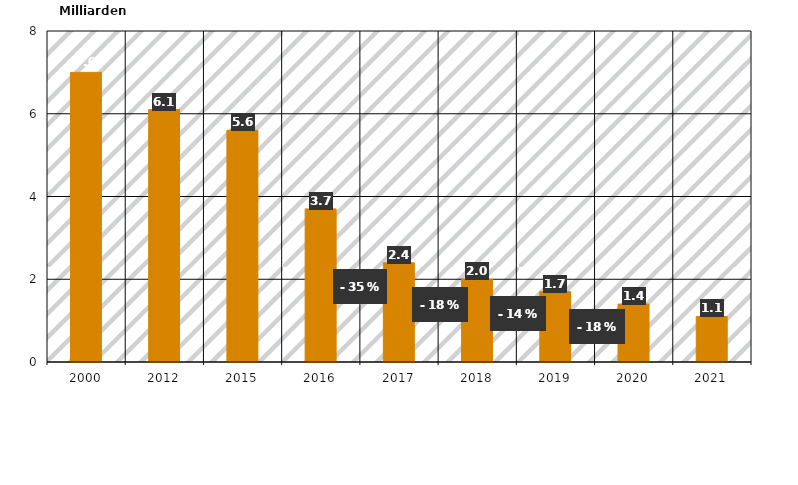
| Category | Verpackungen gesamt |
|---|---|
| 2000.0 | 7 |
| 2012.0 | 6.1 |
| 2015.0 | 5.6 |
| 2016.0 | 3.7 |
| 2017.0 | 2.4 |
| 2018.0 | 2 |
| 2019.0 | 1.7 |
| 2020.0 | 1.4 |
| 2021.0 | 1.1 |